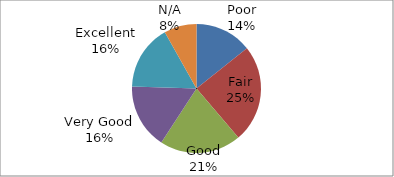
| Category | Series 0 |
|---|---|
| Poor | 7 |
| Fair | 12 |
| Good | 10 |
| Very Good | 8 |
| Excellent | 8 |
| N/A | 4 |